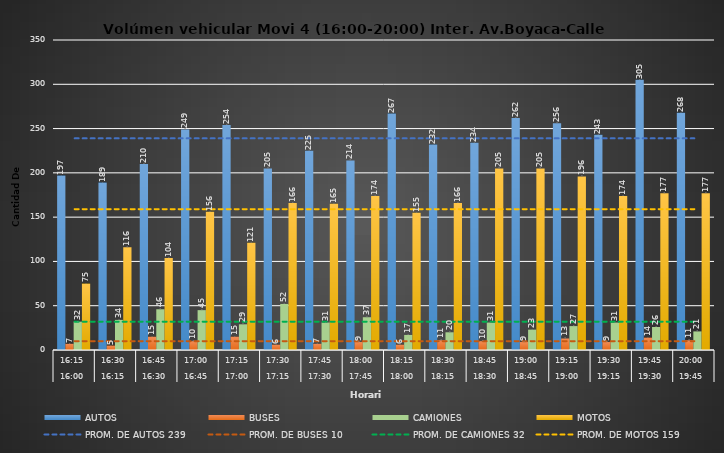
| Category | AUTOS | BUSES | CAMIONES | MOTOS |
|---|---|---|---|---|
| 0 | 197 | 7 | 32 | 75 |
| 1 | 189 | 5 | 34 | 116 |
| 2 | 210 | 15 | 46 | 104 |
| 3 | 249 | 10 | 45 | 156 |
| 4 | 254 | 15 | 29 | 121 |
| 5 | 205 | 6 | 52 | 166 |
| 6 | 225 | 7 | 31 | 165 |
| 7 | 214 | 9 | 37 | 174 |
| 8 | 267 | 6 | 17 | 155 |
| 9 | 232 | 11 | 20 | 166 |
| 10 | 234 | 10 | 31 | 205 |
| 11 | 262 | 9 | 23 | 205 |
| 12 | 256 | 13 | 27 | 196 |
| 13 | 243 | 9 | 31 | 174 |
| 14 | 305 | 14 | 26 | 177 |
| 15 | 268 | 11 | 21 | 177 |